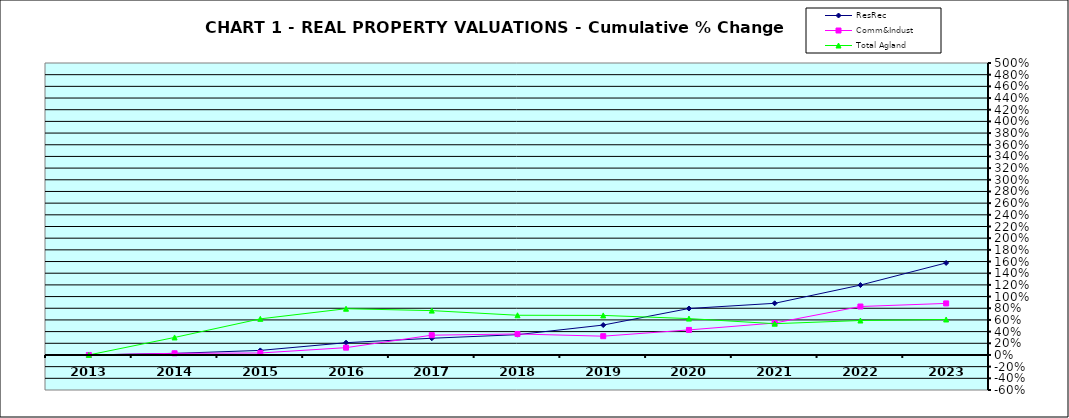
| Category | ResRec | Comm&Indust | Total Agland |
|---|---|---|---|
| 2013.0 | 0 | 0 | 0 |
| 2014.0 | 0.027 | 0.028 | 0.3 |
| 2015.0 | 0.078 | 0.034 | 0.619 |
| 2016.0 | 0.21 | 0.125 | 0.792 |
| 2017.0 | 0.286 | 0.339 | 0.759 |
| 2018.0 | 0.348 | 0.36 | 0.68 |
| 2019.0 | 0.512 | 0.322 | 0.677 |
| 2020.0 | 0.796 | 0.429 | 0.623 |
| 2021.0 | 0.885 | 0.547 | 0.535 |
| 2022.0 | 1.197 | 0.83 | 0.59 |
| 2023.0 | 1.576 | 0.883 | 0.608 |